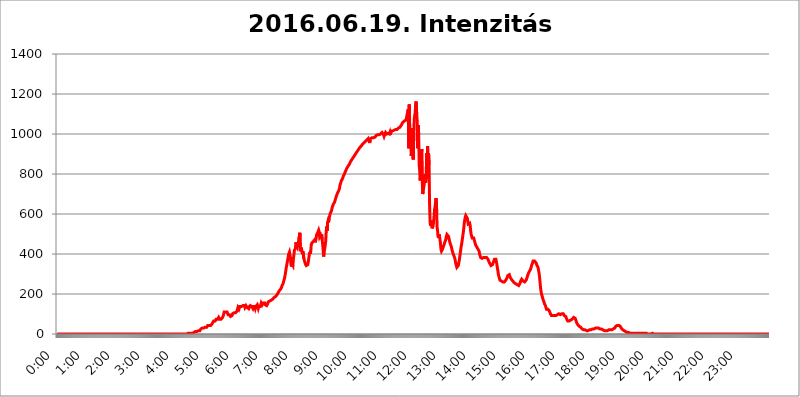
| Category | 2016.06.19. Intenzitás [W/m^2] |
|---|---|
| 0.0 | 0 |
| 0.0006944444444444445 | 0 |
| 0.001388888888888889 | 0 |
| 0.0020833333333333333 | 0 |
| 0.002777777777777778 | 0 |
| 0.003472222222222222 | 0 |
| 0.004166666666666667 | 0 |
| 0.004861111111111111 | 0 |
| 0.005555555555555556 | 0 |
| 0.0062499999999999995 | 0 |
| 0.006944444444444444 | 0 |
| 0.007638888888888889 | 0 |
| 0.008333333333333333 | 0 |
| 0.009027777777777779 | 0 |
| 0.009722222222222222 | 0 |
| 0.010416666666666666 | 0 |
| 0.011111111111111112 | 0 |
| 0.011805555555555555 | 0 |
| 0.012499999999999999 | 0 |
| 0.013194444444444444 | 0 |
| 0.013888888888888888 | 0 |
| 0.014583333333333332 | 0 |
| 0.015277777777777777 | 0 |
| 0.015972222222222224 | 0 |
| 0.016666666666666666 | 0 |
| 0.017361111111111112 | 0 |
| 0.018055555555555557 | 0 |
| 0.01875 | 0 |
| 0.019444444444444445 | 0 |
| 0.02013888888888889 | 0 |
| 0.020833333333333332 | 0 |
| 0.02152777777777778 | 0 |
| 0.022222222222222223 | 0 |
| 0.02291666666666667 | 0 |
| 0.02361111111111111 | 0 |
| 0.024305555555555556 | 0 |
| 0.024999999999999998 | 0 |
| 0.025694444444444447 | 0 |
| 0.02638888888888889 | 0 |
| 0.027083333333333334 | 0 |
| 0.027777777777777776 | 0 |
| 0.02847222222222222 | 0 |
| 0.029166666666666664 | 0 |
| 0.029861111111111113 | 0 |
| 0.030555555555555555 | 0 |
| 0.03125 | 0 |
| 0.03194444444444445 | 0 |
| 0.03263888888888889 | 0 |
| 0.03333333333333333 | 0 |
| 0.034027777777777775 | 0 |
| 0.034722222222222224 | 0 |
| 0.035416666666666666 | 0 |
| 0.036111111111111115 | 0 |
| 0.03680555555555556 | 0 |
| 0.0375 | 0 |
| 0.03819444444444444 | 0 |
| 0.03888888888888889 | 0 |
| 0.03958333333333333 | 0 |
| 0.04027777777777778 | 0 |
| 0.04097222222222222 | 0 |
| 0.041666666666666664 | 0 |
| 0.042361111111111106 | 0 |
| 0.04305555555555556 | 0 |
| 0.043750000000000004 | 0 |
| 0.044444444444444446 | 0 |
| 0.04513888888888889 | 0 |
| 0.04583333333333334 | 0 |
| 0.04652777777777778 | 0 |
| 0.04722222222222222 | 0 |
| 0.04791666666666666 | 0 |
| 0.04861111111111111 | 0 |
| 0.049305555555555554 | 0 |
| 0.049999999999999996 | 0 |
| 0.05069444444444445 | 0 |
| 0.051388888888888894 | 0 |
| 0.052083333333333336 | 0 |
| 0.05277777777777778 | 0 |
| 0.05347222222222222 | 0 |
| 0.05416666666666667 | 0 |
| 0.05486111111111111 | 0 |
| 0.05555555555555555 | 0 |
| 0.05625 | 0 |
| 0.05694444444444444 | 0 |
| 0.057638888888888885 | 0 |
| 0.05833333333333333 | 0 |
| 0.05902777777777778 | 0 |
| 0.059722222222222225 | 0 |
| 0.06041666666666667 | 0 |
| 0.061111111111111116 | 0 |
| 0.06180555555555556 | 0 |
| 0.0625 | 0 |
| 0.06319444444444444 | 0 |
| 0.06388888888888888 | 0 |
| 0.06458333333333334 | 0 |
| 0.06527777777777778 | 0 |
| 0.06597222222222222 | 0 |
| 0.06666666666666667 | 0 |
| 0.06736111111111111 | 0 |
| 0.06805555555555555 | 0 |
| 0.06874999999999999 | 0 |
| 0.06944444444444443 | 0 |
| 0.07013888888888889 | 0 |
| 0.07083333333333333 | 0 |
| 0.07152777777777779 | 0 |
| 0.07222222222222223 | 0 |
| 0.07291666666666667 | 0 |
| 0.07361111111111111 | 0 |
| 0.07430555555555556 | 0 |
| 0.075 | 0 |
| 0.07569444444444444 | 0 |
| 0.0763888888888889 | 0 |
| 0.07708333333333334 | 0 |
| 0.07777777777777778 | 0 |
| 0.07847222222222222 | 0 |
| 0.07916666666666666 | 0 |
| 0.0798611111111111 | 0 |
| 0.08055555555555556 | 0 |
| 0.08125 | 0 |
| 0.08194444444444444 | 0 |
| 0.08263888888888889 | 0 |
| 0.08333333333333333 | 0 |
| 0.08402777777777777 | 0 |
| 0.08472222222222221 | 0 |
| 0.08541666666666665 | 0 |
| 0.08611111111111112 | 0 |
| 0.08680555555555557 | 0 |
| 0.08750000000000001 | 0 |
| 0.08819444444444445 | 0 |
| 0.08888888888888889 | 0 |
| 0.08958333333333333 | 0 |
| 0.09027777777777778 | 0 |
| 0.09097222222222222 | 0 |
| 0.09166666666666667 | 0 |
| 0.09236111111111112 | 0 |
| 0.09305555555555556 | 0 |
| 0.09375 | 0 |
| 0.09444444444444444 | 0 |
| 0.09513888888888888 | 0 |
| 0.09583333333333333 | 0 |
| 0.09652777777777777 | 0 |
| 0.09722222222222222 | 0 |
| 0.09791666666666667 | 0 |
| 0.09861111111111111 | 0 |
| 0.09930555555555555 | 0 |
| 0.09999999999999999 | 0 |
| 0.10069444444444443 | 0 |
| 0.1013888888888889 | 0 |
| 0.10208333333333335 | 0 |
| 0.10277777777777779 | 0 |
| 0.10347222222222223 | 0 |
| 0.10416666666666667 | 0 |
| 0.10486111111111111 | 0 |
| 0.10555555555555556 | 0 |
| 0.10625 | 0 |
| 0.10694444444444444 | 0 |
| 0.1076388888888889 | 0 |
| 0.10833333333333334 | 0 |
| 0.10902777777777778 | 0 |
| 0.10972222222222222 | 0 |
| 0.1111111111111111 | 0 |
| 0.11180555555555556 | 0 |
| 0.11180555555555556 | 0 |
| 0.1125 | 0 |
| 0.11319444444444444 | 0 |
| 0.11388888888888889 | 0 |
| 0.11458333333333333 | 0 |
| 0.11527777777777777 | 0 |
| 0.11597222222222221 | 0 |
| 0.11666666666666665 | 0 |
| 0.1173611111111111 | 0 |
| 0.11805555555555557 | 0 |
| 0.11944444444444445 | 0 |
| 0.12013888888888889 | 0 |
| 0.12083333333333333 | 0 |
| 0.12152777777777778 | 0 |
| 0.12222222222222223 | 0 |
| 0.12291666666666667 | 0 |
| 0.12291666666666667 | 0 |
| 0.12361111111111112 | 0 |
| 0.12430555555555556 | 0 |
| 0.125 | 0 |
| 0.12569444444444444 | 0 |
| 0.12638888888888888 | 0 |
| 0.12708333333333333 | 0 |
| 0.16875 | 0 |
| 0.12847222222222224 | 0 |
| 0.12916666666666668 | 0 |
| 0.12986111111111112 | 0 |
| 0.13055555555555556 | 0 |
| 0.13125 | 0 |
| 0.13194444444444445 | 0 |
| 0.1326388888888889 | 0 |
| 0.13333333333333333 | 0 |
| 0.13402777777777777 | 0 |
| 0.13402777777777777 | 0 |
| 0.13472222222222222 | 0 |
| 0.13541666666666666 | 0 |
| 0.1361111111111111 | 0 |
| 0.13749999999999998 | 0 |
| 0.13819444444444443 | 0 |
| 0.1388888888888889 | 0 |
| 0.13958333333333334 | 0 |
| 0.14027777777777778 | 0 |
| 0.14097222222222222 | 0 |
| 0.14166666666666666 | 0 |
| 0.1423611111111111 | 0 |
| 0.14305555555555557 | 0 |
| 0.14375000000000002 | 0 |
| 0.14444444444444446 | 0 |
| 0.1451388888888889 | 0 |
| 0.1451388888888889 | 0 |
| 0.14652777777777778 | 0 |
| 0.14722222222222223 | 0 |
| 0.14791666666666667 | 0 |
| 0.1486111111111111 | 0 |
| 0.14930555555555555 | 0 |
| 0.15 | 0 |
| 0.15069444444444444 | 0 |
| 0.15138888888888888 | 0 |
| 0.15208333333333332 | 0 |
| 0.15277777777777776 | 0 |
| 0.15347222222222223 | 0 |
| 0.15416666666666667 | 0 |
| 0.15486111111111112 | 0 |
| 0.15555555555555556 | 0 |
| 0.15625 | 0 |
| 0.15694444444444444 | 0 |
| 0.15763888888888888 | 0 |
| 0.15833333333333333 | 0 |
| 0.15902777777777777 | 0 |
| 0.15972222222222224 | 0 |
| 0.16041666666666668 | 0 |
| 0.16111111111111112 | 0 |
| 0.16180555555555556 | 0 |
| 0.1625 | 0 |
| 0.16319444444444445 | 0 |
| 0.1638888888888889 | 0 |
| 0.16458333333333333 | 0 |
| 0.16527777777777777 | 0 |
| 0.16597222222222222 | 0 |
| 0.16666666666666666 | 0 |
| 0.1673611111111111 | 0 |
| 0.16805555555555554 | 0 |
| 0.16874999999999998 | 0 |
| 0.16944444444444443 | 0 |
| 0.17013888888888887 | 0 |
| 0.1708333333333333 | 0 |
| 0.17152777777777775 | 0 |
| 0.17222222222222225 | 0 |
| 0.1729166666666667 | 0 |
| 0.17361111111111113 | 0 |
| 0.17430555555555557 | 0 |
| 0.17500000000000002 | 0 |
| 0.17569444444444446 | 0 |
| 0.1763888888888889 | 0 |
| 0.17708333333333334 | 0 |
| 0.17777777777777778 | 0 |
| 0.17847222222222223 | 0 |
| 0.17916666666666667 | 0 |
| 0.1798611111111111 | 0 |
| 0.18055555555555555 | 0 |
| 0.18125 | 0 |
| 0.18194444444444444 | 3.525 |
| 0.1826388888888889 | 3.525 |
| 0.18333333333333335 | 3.525 |
| 0.1840277777777778 | 3.525 |
| 0.18472222222222223 | 3.525 |
| 0.18541666666666667 | 3.525 |
| 0.18611111111111112 | 3.525 |
| 0.18680555555555556 | 3.525 |
| 0.1875 | 3.525 |
| 0.18819444444444444 | 3.525 |
| 0.18888888888888888 | 3.525 |
| 0.18958333333333333 | 3.525 |
| 0.19027777777777777 | 7.887 |
| 0.1909722222222222 | 7.887 |
| 0.19166666666666665 | 7.887 |
| 0.19236111111111112 | 7.887 |
| 0.19305555555555554 | 7.887 |
| 0.19375 | 12.257 |
| 0.19444444444444445 | 12.257 |
| 0.1951388888888889 | 12.257 |
| 0.19583333333333333 | 12.257 |
| 0.19652777777777777 | 12.257 |
| 0.19722222222222222 | 16.636 |
| 0.19791666666666666 | 16.636 |
| 0.1986111111111111 | 16.636 |
| 0.19930555555555554 | 16.636 |
| 0.19999999999999998 | 16.636 |
| 0.20069444444444443 | 21.024 |
| 0.20138888888888887 | 25.419 |
| 0.2020833333333333 | 25.419 |
| 0.2027777777777778 | 25.419 |
| 0.2034722222222222 | 29.823 |
| 0.2041666666666667 | 29.823 |
| 0.20486111111111113 | 29.823 |
| 0.20555555555555557 | 29.823 |
| 0.20625000000000002 | 34.234 |
| 0.20694444444444446 | 34.234 |
| 0.2076388888888889 | 34.234 |
| 0.20833333333333334 | 34.234 |
| 0.20902777777777778 | 34.234 |
| 0.20972222222222223 | 34.234 |
| 0.21041666666666667 | 38.653 |
| 0.2111111111111111 | 43.079 |
| 0.21180555555555555 | 43.079 |
| 0.2125 | 43.079 |
| 0.21319444444444444 | 43.079 |
| 0.2138888888888889 | 43.079 |
| 0.21458333333333335 | 43.079 |
| 0.2152777777777778 | 43.079 |
| 0.21597222222222223 | 43.079 |
| 0.21666666666666667 | 47.511 |
| 0.21736111111111112 | 51.951 |
| 0.21805555555555556 | 56.398 |
| 0.21875 | 56.398 |
| 0.21944444444444444 | 65.31 |
| 0.22013888888888888 | 65.31 |
| 0.22083333333333333 | 65.31 |
| 0.22152777777777777 | 65.31 |
| 0.2222222222222222 | 65.31 |
| 0.22291666666666665 | 74.246 |
| 0.2236111111111111 | 74.246 |
| 0.22430555555555556 | 78.722 |
| 0.225 | 74.246 |
| 0.22569444444444445 | 78.722 |
| 0.2263888888888889 | 83.205 |
| 0.22708333333333333 | 83.205 |
| 0.22777777777777777 | 74.246 |
| 0.22847222222222222 | 74.246 |
| 0.22916666666666666 | 74.246 |
| 0.2298611111111111 | 74.246 |
| 0.23055555555555554 | 74.246 |
| 0.23124999999999998 | 78.722 |
| 0.23194444444444443 | 83.205 |
| 0.23263888888888887 | 78.722 |
| 0.2333333333333333 | 96.682 |
| 0.2340277777777778 | 110.201 |
| 0.2347222222222222 | 110.201 |
| 0.2354166666666667 | 110.201 |
| 0.23611111111111113 | 110.201 |
| 0.23680555555555557 | 110.201 |
| 0.23750000000000002 | 110.201 |
| 0.23819444444444446 | 110.201 |
| 0.2388888888888889 | 110.201 |
| 0.23958333333333334 | 96.682 |
| 0.24027777777777778 | 101.184 |
| 0.24097222222222223 | 92.184 |
| 0.24166666666666667 | 96.682 |
| 0.2423611111111111 | 96.682 |
| 0.24305555555555555 | 87.692 |
| 0.24375 | 87.692 |
| 0.24444444444444446 | 87.692 |
| 0.24513888888888888 | 92.184 |
| 0.24583333333333335 | 101.184 |
| 0.2465277777777778 | 101.184 |
| 0.24722222222222223 | 105.69 |
| 0.24791666666666667 | 105.69 |
| 0.24861111111111112 | 110.201 |
| 0.24930555555555556 | 110.201 |
| 0.25 | 105.69 |
| 0.25069444444444444 | 101.184 |
| 0.2513888888888889 | 110.201 |
| 0.2520833333333333 | 114.716 |
| 0.25277777777777777 | 123.758 |
| 0.2534722222222222 | 132.814 |
| 0.25416666666666665 | 137.347 |
| 0.2548611111111111 | 123.758 |
| 0.2555555555555556 | 128.284 |
| 0.25625000000000003 | 137.347 |
| 0.2569444444444445 | 141.884 |
| 0.2576388888888889 | 132.814 |
| 0.25833333333333336 | 137.347 |
| 0.2590277777777778 | 141.884 |
| 0.25972222222222224 | 141.884 |
| 0.2604166666666667 | 141.884 |
| 0.2611111111111111 | 141.884 |
| 0.26180555555555557 | 141.884 |
| 0.2625 | 141.884 |
| 0.26319444444444445 | 132.814 |
| 0.2638888888888889 | 137.347 |
| 0.26458333333333334 | 141.884 |
| 0.2652777777777778 | 137.347 |
| 0.2659722222222222 | 132.814 |
| 0.26666666666666666 | 128.284 |
| 0.2673611111111111 | 128.284 |
| 0.26805555555555555 | 128.284 |
| 0.26875 | 141.884 |
| 0.26944444444444443 | 132.814 |
| 0.2701388888888889 | 137.347 |
| 0.2708333333333333 | 141.884 |
| 0.27152777777777776 | 137.347 |
| 0.2722222222222222 | 137.347 |
| 0.27291666666666664 | 137.347 |
| 0.2736111111111111 | 132.814 |
| 0.2743055555555555 | 128.284 |
| 0.27499999999999997 | 137.347 |
| 0.27569444444444446 | 137.347 |
| 0.27638888888888885 | 137.347 |
| 0.27708333333333335 | 137.347 |
| 0.2777777777777778 | 128.284 |
| 0.27847222222222223 | 137.347 |
| 0.2791666666666667 | 137.347 |
| 0.2798611111111111 | 141.884 |
| 0.28055555555555556 | 146.423 |
| 0.28125 | 146.423 |
| 0.28194444444444444 | 128.284 |
| 0.2826388888888889 | 137.347 |
| 0.2833333333333333 | 141.884 |
| 0.28402777777777777 | 141.884 |
| 0.2847222222222222 | 137.347 |
| 0.28541666666666665 | 137.347 |
| 0.28611111111111115 | 155.509 |
| 0.28680555555555554 | 150.964 |
| 0.28750000000000003 | 146.423 |
| 0.2881944444444445 | 146.423 |
| 0.2888888888888889 | 155.509 |
| 0.28958333333333336 | 155.509 |
| 0.2902777777777778 | 155.509 |
| 0.29097222222222224 | 155.509 |
| 0.2916666666666667 | 146.423 |
| 0.2923611111111111 | 146.423 |
| 0.29305555555555557 | 141.884 |
| 0.29375 | 141.884 |
| 0.29444444444444445 | 146.423 |
| 0.2951388888888889 | 150.964 |
| 0.29583333333333334 | 160.056 |
| 0.2965277777777778 | 155.509 |
| 0.2972222222222222 | 160.056 |
| 0.29791666666666666 | 164.605 |
| 0.2986111111111111 | 169.156 |
| 0.29930555555555555 | 169.156 |
| 0.3 | 169.156 |
| 0.30069444444444443 | 169.156 |
| 0.3013888888888889 | 173.709 |
| 0.3020833333333333 | 173.709 |
| 0.30277777777777776 | 178.264 |
| 0.3034722222222222 | 178.264 |
| 0.30416666666666664 | 182.82 |
| 0.3048611111111111 | 182.82 |
| 0.3055555555555555 | 187.378 |
| 0.30624999999999997 | 187.378 |
| 0.3069444444444444 | 191.937 |
| 0.3076388888888889 | 191.937 |
| 0.30833333333333335 | 196.497 |
| 0.3090277777777778 | 201.058 |
| 0.30972222222222223 | 205.62 |
| 0.3104166666666667 | 210.182 |
| 0.3111111111111111 | 214.746 |
| 0.31180555555555556 | 219.309 |
| 0.3125 | 219.309 |
| 0.31319444444444444 | 223.873 |
| 0.3138888888888889 | 228.436 |
| 0.3145833333333333 | 233 |
| 0.31527777777777777 | 242.127 |
| 0.3159722222222222 | 246.689 |
| 0.31666666666666665 | 251.251 |
| 0.31736111111111115 | 260.373 |
| 0.31805555555555554 | 269.49 |
| 0.31875000000000003 | 278.603 |
| 0.3194444444444445 | 292.259 |
| 0.3201388888888889 | 305.898 |
| 0.32083333333333336 | 324.052 |
| 0.3215277777777778 | 337.639 |
| 0.32222222222222224 | 351.198 |
| 0.3229166666666667 | 364.728 |
| 0.3236111111111111 | 378.224 |
| 0.32430555555555557 | 396.164 |
| 0.325 | 396.164 |
| 0.32569444444444445 | 409.574 |
| 0.3263888888888889 | 405.108 |
| 0.32708333333333334 | 382.715 |
| 0.3277777777777778 | 346.682 |
| 0.3284722222222222 | 337.639 |
| 0.32916666666666666 | 351.198 |
| 0.3298611111111111 | 355.712 |
| 0.33055555555555555 | 342.162 |
| 0.33125 | 378.224 |
| 0.33194444444444443 | 396.164 |
| 0.3326388888888889 | 418.492 |
| 0.3333333333333333 | 414.035 |
| 0.3340277777777778 | 427.39 |
| 0.3347222222222222 | 458.38 |
| 0.3354166666666667 | 453.968 |
| 0.3361111111111111 | 458.38 |
| 0.3368055555555556 | 436.27 |
| 0.33749999999999997 | 431.833 |
| 0.33819444444444446 | 453.968 |
| 0.33888888888888885 | 480.356 |
| 0.33958333333333335 | 489.108 |
| 0.34027777777777773 | 506.542 |
| 0.34097222222222223 | 414.035 |
| 0.3416666666666666 | 409.574 |
| 0.3423611111111111 | 431.833 |
| 0.3430555555555555 | 414.035 |
| 0.34375 | 400.638 |
| 0.3444444444444445 | 414.035 |
| 0.3451388888888889 | 409.574 |
| 0.3458333333333334 | 378.224 |
| 0.34652777777777777 | 369.23 |
| 0.34722222222222227 | 360.221 |
| 0.34791666666666665 | 351.198 |
| 0.34861111111111115 | 346.682 |
| 0.34930555555555554 | 342.162 |
| 0.35000000000000003 | 342.162 |
| 0.3506944444444444 | 342.162 |
| 0.3513888888888889 | 346.682 |
| 0.3520833333333333 | 360.221 |
| 0.3527777777777778 | 378.224 |
| 0.3534722222222222 | 396.164 |
| 0.3541666666666667 | 409.574 |
| 0.3548611111111111 | 400.638 |
| 0.35555555555555557 | 414.035 |
| 0.35625 | 445.129 |
| 0.35694444444444445 | 453.968 |
| 0.3576388888888889 | 453.968 |
| 0.35833333333333334 | 458.38 |
| 0.3590277777777778 | 462.786 |
| 0.3597222222222222 | 458.38 |
| 0.36041666666666666 | 462.786 |
| 0.3611111111111111 | 471.582 |
| 0.36180555555555555 | 458.38 |
| 0.3625 | 467.187 |
| 0.36319444444444443 | 480.356 |
| 0.3638888888888889 | 497.836 |
| 0.3645833333333333 | 502.192 |
| 0.3652777777777778 | 506.542 |
| 0.3659722222222222 | 506.542 |
| 0.3666666666666667 | 519.555 |
| 0.3673611111111111 | 510.885 |
| 0.3680555555555556 | 484.735 |
| 0.36874999999999997 | 489.108 |
| 0.36944444444444446 | 493.475 |
| 0.37013888888888885 | 484.735 |
| 0.37083333333333335 | 497.836 |
| 0.37152777777777773 | 471.582 |
| 0.37222222222222223 | 449.551 |
| 0.3729166666666666 | 418.492 |
| 0.3736111111111111 | 387.202 |
| 0.3743055555555555 | 409.574 |
| 0.375 | 422.943 |
| 0.3756944444444445 | 440.702 |
| 0.3763888888888889 | 458.38 |
| 0.3770833333333334 | 502.192 |
| 0.37777777777777777 | 536.82 |
| 0.37847222222222227 | 515.223 |
| 0.37916666666666665 | 558.261 |
| 0.37986111111111115 | 566.793 |
| 0.38055555555555554 | 558.261 |
| 0.38125000000000003 | 579.542 |
| 0.3819444444444444 | 588.009 |
| 0.3826388888888889 | 600.661 |
| 0.3833333333333333 | 604.864 |
| 0.3840277777777778 | 600.661 |
| 0.3847222222222222 | 617.436 |
| 0.3854166666666667 | 629.948 |
| 0.3861111111111111 | 638.256 |
| 0.38680555555555557 | 642.4 |
| 0.3875 | 650.667 |
| 0.38819444444444445 | 654.791 |
| 0.3888888888888889 | 658.909 |
| 0.38958333333333334 | 667.123 |
| 0.3902777777777778 | 675.311 |
| 0.3909722222222222 | 683.473 |
| 0.39166666666666666 | 691.608 |
| 0.3923611111111111 | 687.544 |
| 0.39305555555555555 | 703.762 |
| 0.39375 | 707.8 |
| 0.39444444444444443 | 703.762 |
| 0.3951388888888889 | 719.877 |
| 0.3958333333333333 | 727.896 |
| 0.3965277777777778 | 743.859 |
| 0.3972222222222222 | 751.803 |
| 0.3979166666666667 | 759.723 |
| 0.3986111111111111 | 767.62 |
| 0.3993055555555556 | 771.559 |
| 0.39999999999999997 | 775.492 |
| 0.40069444444444446 | 783.342 |
| 0.40138888888888885 | 791.169 |
| 0.40208333333333335 | 795.074 |
| 0.40277777777777773 | 798.974 |
| 0.40347222222222223 | 806.757 |
| 0.4041666666666666 | 810.641 |
| 0.4048611111111111 | 818.392 |
| 0.4055555555555555 | 822.26 |
| 0.40625 | 829.981 |
| 0.4069444444444445 | 829.981 |
| 0.4076388888888889 | 837.682 |
| 0.4083333333333334 | 841.526 |
| 0.40902777777777777 | 845.365 |
| 0.40972222222222227 | 849.199 |
| 0.41041666666666665 | 853.029 |
| 0.41111111111111115 | 860.676 |
| 0.41180555555555554 | 860.676 |
| 0.41250000000000003 | 868.305 |
| 0.4131944444444444 | 868.305 |
| 0.4138888888888889 | 875.918 |
| 0.4145833333333333 | 875.918 |
| 0.4152777777777778 | 883.516 |
| 0.4159722222222222 | 887.309 |
| 0.4166666666666667 | 887.309 |
| 0.4173611111111111 | 894.885 |
| 0.41805555555555557 | 898.668 |
| 0.41875 | 902.447 |
| 0.41944444444444445 | 906.223 |
| 0.4201388888888889 | 909.996 |
| 0.42083333333333334 | 913.766 |
| 0.4215277777777778 | 917.534 |
| 0.4222222222222222 | 921.298 |
| 0.42291666666666666 | 925.06 |
| 0.4236111111111111 | 928.819 |
| 0.42430555555555555 | 932.576 |
| 0.425 | 932.576 |
| 0.42569444444444443 | 936.33 |
| 0.4263888888888889 | 940.082 |
| 0.4270833333333333 | 943.832 |
| 0.4277777777777778 | 947.58 |
| 0.4284722222222222 | 947.58 |
| 0.4291666666666667 | 951.327 |
| 0.4298611111111111 | 955.071 |
| 0.4305555555555556 | 955.071 |
| 0.43124999999999997 | 958.814 |
| 0.43194444444444446 | 962.555 |
| 0.43263888888888885 | 966.295 |
| 0.43333333333333335 | 966.295 |
| 0.43402777777777773 | 970.034 |
| 0.43472222222222223 | 973.772 |
| 0.4354166666666666 | 973.772 |
| 0.4361111111111111 | 977.508 |
| 0.4368055555555555 | 973.772 |
| 0.4375 | 962.555 |
| 0.4381944444444445 | 955.071 |
| 0.4388888888888889 | 970.034 |
| 0.4395833333333334 | 977.508 |
| 0.44027777777777777 | 977.508 |
| 0.44097222222222227 | 981.244 |
| 0.44166666666666665 | 981.244 |
| 0.44236111111111115 | 981.244 |
| 0.44305555555555554 | 981.244 |
| 0.44375000000000003 | 981.244 |
| 0.4444444444444444 | 981.244 |
| 0.4451388888888889 | 984.98 |
| 0.4458333333333333 | 984.98 |
| 0.4465277777777778 | 988.714 |
| 0.4472222222222222 | 992.448 |
| 0.4479166666666667 | 992.448 |
| 0.4486111111111111 | 992.448 |
| 0.44930555555555557 | 996.182 |
| 0.45 | 996.182 |
| 0.45069444444444445 | 996.182 |
| 0.4513888888888889 | 996.182 |
| 0.45208333333333334 | 999.916 |
| 0.4527777777777778 | 999.916 |
| 0.4534722222222222 | 999.916 |
| 0.45416666666666666 | 1003.65 |
| 0.4548611111111111 | 1003.65 |
| 0.45555555555555555 | 1007.383 |
| 0.45625 | 1011.118 |
| 0.45694444444444443 | 1003.65 |
| 0.4576388888888889 | 996.182 |
| 0.4583333333333333 | 988.714 |
| 0.4590277777777778 | 996.182 |
| 0.4597222222222222 | 992.448 |
| 0.4604166666666667 | 1007.383 |
| 0.4611111111111111 | 1011.118 |
| 0.4618055555555556 | 999.916 |
| 0.46249999999999997 | 999.916 |
| 0.46319444444444446 | 999.916 |
| 0.46388888888888885 | 1003.65 |
| 0.46458333333333335 | 1007.383 |
| 0.46527777777777773 | 1007.383 |
| 0.46597222222222223 | 999.916 |
| 0.4666666666666666 | 1007.383 |
| 0.4673611111111111 | 996.182 |
| 0.4680555555555555 | 1014.852 |
| 0.46875 | 1014.852 |
| 0.4694444444444445 | 1018.587 |
| 0.4701388888888889 | 1014.852 |
| 0.4708333333333334 | 1018.587 |
| 0.47152777777777777 | 1018.587 |
| 0.47222222222222227 | 1018.587 |
| 0.47291666666666665 | 1022.323 |
| 0.47361111111111115 | 1022.323 |
| 0.47430555555555554 | 1022.323 |
| 0.47500000000000003 | 1022.323 |
| 0.4756944444444444 | 1022.323 |
| 0.4763888888888889 | 1022.323 |
| 0.4770833333333333 | 1026.06 |
| 0.4777777777777778 | 1026.06 |
| 0.4784722222222222 | 1029.798 |
| 0.4791666666666667 | 1029.798 |
| 0.4798611111111111 | 1029.798 |
| 0.48055555555555557 | 1033.537 |
| 0.48125 | 1037.277 |
| 0.48194444444444445 | 1041.019 |
| 0.4826388888888889 | 1044.762 |
| 0.48333333333333334 | 1048.508 |
| 0.4840277777777778 | 1056.004 |
| 0.4847222222222222 | 1056.004 |
| 0.48541666666666666 | 1059.756 |
| 0.4861111111111111 | 1063.51 |
| 0.48680555555555555 | 1067.267 |
| 0.4875 | 1067.267 |
| 0.48819444444444443 | 1067.267 |
| 0.4888888888888889 | 1071.027 |
| 0.4895833333333333 | 1074.789 |
| 0.4902777777777778 | 1089.873 |
| 0.4909722222222222 | 1101.226 |
| 0.4916666666666667 | 1116.426 |
| 0.4923611111111111 | 1124.056 |
| 0.4930555555555556 | 928.819 |
| 0.49374999999999997 | 1147.086 |
| 0.49444444444444446 | 999.916 |
| 0.49513888888888885 | 999.916 |
| 0.49583333333333335 | 962.555 |
| 0.49652777777777773 | 891.099 |
| 0.49722222222222223 | 925.06 |
| 0.4979166666666666 | 1029.798 |
| 0.4986111111111111 | 1029.798 |
| 0.4993055555555555 | 872.114 |
| 0.5 | 996.182 |
| 0.5006944444444444 | 1071.027 |
| 0.5013888888888889 | 1093.653 |
| 0.5020833333333333 | 1108.816 |
| 0.5027777777777778 | 1154.814 |
| 0.5034722222222222 | 1162.571 |
| 0.5041666666666667 | 1097.437 |
| 0.5048611111111111 | 1063.51 |
| 0.5055555555555555 | 928.819 |
| 0.50625 | 1044.762 |
| 0.5069444444444444 | 999.916 |
| 0.5076388888888889 | 845.365 |
| 0.5083333333333333 | 818.392 |
| 0.5090277777777777 | 767.62 |
| 0.5097222222222222 | 798.974 |
| 0.5104166666666666 | 779.42 |
| 0.5111111111111112 | 925.06 |
| 0.5118055555555555 | 783.342 |
| 0.5125000000000001 | 699.717 |
| 0.5131944444444444 | 711.832 |
| 0.513888888888889 | 715.858 |
| 0.5145833333333333 | 747.834 |
| 0.5152777777777778 | 787.258 |
| 0.5159722222222222 | 798.974 |
| 0.5166666666666667 | 755.766 |
| 0.517361111111111 | 771.559 |
| 0.5180555555555556 | 902.447 |
| 0.5187499999999999 | 814.519 |
| 0.5194444444444445 | 940.082 |
| 0.5201388888888888 | 775.492 |
| 0.5208333333333334 | 902.447 |
| 0.5215277777777778 | 845.365 |
| 0.5222222222222223 | 646.537 |
| 0.5229166666666667 | 558.261 |
| 0.5236111111111111 | 541.121 |
| 0.5243055555555556 | 566.793 |
| 0.525 | 549.704 |
| 0.5256944444444445 | 528.2 |
| 0.5263888888888889 | 528.2 |
| 0.5270833333333333 | 541.121 |
| 0.5277777777777778 | 558.261 |
| 0.5284722222222222 | 583.779 |
| 0.5291666666666667 | 621.613 |
| 0.5298611111111111 | 634.105 |
| 0.5305555555555556 | 658.909 |
| 0.53125 | 679.395 |
| 0.5319444444444444 | 650.667 |
| 0.5326388888888889 | 536.82 |
| 0.5333333333333333 | 519.555 |
| 0.5340277777777778 | 489.108 |
| 0.5347222222222222 | 480.356 |
| 0.5354166666666667 | 497.836 |
| 0.5361111111111111 | 489.108 |
| 0.5368055555555555 | 471.582 |
| 0.5375 | 453.968 |
| 0.5381944444444444 | 422.943 |
| 0.5388888888888889 | 414.035 |
| 0.5395833333333333 | 414.035 |
| 0.5402777777777777 | 422.943 |
| 0.5409722222222222 | 431.833 |
| 0.5416666666666666 | 436.27 |
| 0.5423611111111112 | 445.129 |
| 0.5430555555555555 | 453.968 |
| 0.5437500000000001 | 458.38 |
| 0.5444444444444444 | 467.187 |
| 0.545138888888889 | 475.972 |
| 0.5458333333333333 | 489.108 |
| 0.5465277777777778 | 497.836 |
| 0.5472222222222222 | 502.192 |
| 0.5479166666666667 | 497.836 |
| 0.548611111111111 | 489.108 |
| 0.5493055555555556 | 480.356 |
| 0.5499999999999999 | 467.187 |
| 0.5506944444444445 | 458.38 |
| 0.5513888888888888 | 449.551 |
| 0.5520833333333334 | 445.129 |
| 0.5527777777777778 | 436.27 |
| 0.5534722222222223 | 422.943 |
| 0.5541666666666667 | 414.035 |
| 0.5548611111111111 | 405.108 |
| 0.5555555555555556 | 400.638 |
| 0.55625 | 391.685 |
| 0.5569444444444445 | 387.202 |
| 0.5576388888888889 | 378.224 |
| 0.5583333333333333 | 364.728 |
| 0.5590277777777778 | 351.198 |
| 0.5597222222222222 | 342.162 |
| 0.5604166666666667 | 333.113 |
| 0.5611111111111111 | 333.113 |
| 0.5618055555555556 | 333.113 |
| 0.5625 | 342.162 |
| 0.5631944444444444 | 355.712 |
| 0.5638888888888889 | 369.23 |
| 0.5645833333333333 | 387.202 |
| 0.5652777777777778 | 405.108 |
| 0.5659722222222222 | 422.943 |
| 0.5666666666666667 | 440.702 |
| 0.5673611111111111 | 453.968 |
| 0.5680555555555555 | 471.582 |
| 0.56875 | 489.108 |
| 0.5694444444444444 | 506.542 |
| 0.5701388888888889 | 528.2 |
| 0.5708333333333333 | 553.986 |
| 0.5715277777777777 | 571.049 |
| 0.5722222222222222 | 583.779 |
| 0.5729166666666666 | 592.233 |
| 0.5736111111111112 | 596.45 |
| 0.5743055555555555 | 588.009 |
| 0.5750000000000001 | 579.542 |
| 0.5756944444444444 | 566.793 |
| 0.576388888888889 | 549.704 |
| 0.5770833333333333 | 549.704 |
| 0.5777777777777778 | 549.704 |
| 0.5784722222222222 | 553.986 |
| 0.5791666666666667 | 541.121 |
| 0.579861111111111 | 515.223 |
| 0.5805555555555556 | 497.836 |
| 0.5812499999999999 | 489.108 |
| 0.5819444444444445 | 480.356 |
| 0.5826388888888888 | 475.972 |
| 0.5833333333333334 | 480.356 |
| 0.5840277777777778 | 480.356 |
| 0.5847222222222223 | 475.972 |
| 0.5854166666666667 | 462.786 |
| 0.5861111111111111 | 453.968 |
| 0.5868055555555556 | 445.129 |
| 0.5875 | 440.702 |
| 0.5881944444444445 | 436.27 |
| 0.5888888888888889 | 436.27 |
| 0.5895833333333333 | 431.833 |
| 0.5902777777777778 | 422.943 |
| 0.5909722222222222 | 418.492 |
| 0.5916666666666667 | 414.035 |
| 0.5923611111111111 | 400.638 |
| 0.5930555555555556 | 391.685 |
| 0.59375 | 382.715 |
| 0.5944444444444444 | 378.224 |
| 0.5951388888888889 | 378.224 |
| 0.5958333333333333 | 378.224 |
| 0.5965277777777778 | 382.715 |
| 0.5972222222222222 | 382.715 |
| 0.5979166666666667 | 382.715 |
| 0.5986111111111111 | 382.715 |
| 0.5993055555555555 | 382.715 |
| 0.6 | 382.715 |
| 0.6006944444444444 | 387.202 |
| 0.6013888888888889 | 382.715 |
| 0.6020833333333333 | 382.715 |
| 0.6027777777777777 | 378.224 |
| 0.6034722222222222 | 378.224 |
| 0.6041666666666666 | 373.729 |
| 0.6048611111111112 | 369.23 |
| 0.6055555555555555 | 360.221 |
| 0.6062500000000001 | 355.712 |
| 0.6069444444444444 | 351.198 |
| 0.607638888888889 | 346.682 |
| 0.6083333333333333 | 342.162 |
| 0.6090277777777778 | 342.162 |
| 0.6097222222222222 | 342.162 |
| 0.6104166666666667 | 346.682 |
| 0.611111111111111 | 351.198 |
| 0.6118055555555556 | 360.221 |
| 0.6124999999999999 | 364.728 |
| 0.6131944444444445 | 373.729 |
| 0.6138888888888888 | 378.224 |
| 0.6145833333333334 | 378.224 |
| 0.6152777777777778 | 373.729 |
| 0.6159722222222223 | 360.221 |
| 0.6166666666666667 | 346.682 |
| 0.6173611111111111 | 328.584 |
| 0.6180555555555556 | 314.98 |
| 0.61875 | 296.808 |
| 0.6194444444444445 | 287.709 |
| 0.6201388888888889 | 278.603 |
| 0.6208333333333333 | 269.49 |
| 0.6215277777777778 | 269.49 |
| 0.6222222222222222 | 264.932 |
| 0.6229166666666667 | 264.932 |
| 0.6236111111111111 | 264.932 |
| 0.6243055555555556 | 260.373 |
| 0.625 | 260.373 |
| 0.6256944444444444 | 260.373 |
| 0.6263888888888889 | 260.373 |
| 0.6270833333333333 | 260.373 |
| 0.6277777777777778 | 264.932 |
| 0.6284722222222222 | 264.932 |
| 0.6291666666666667 | 269.49 |
| 0.6298611111111111 | 274.047 |
| 0.6305555555555555 | 278.603 |
| 0.63125 | 283.156 |
| 0.6319444444444444 | 292.259 |
| 0.6326388888888889 | 296.808 |
| 0.6333333333333333 | 296.808 |
| 0.6340277777777777 | 296.808 |
| 0.6347222222222222 | 292.259 |
| 0.6354166666666666 | 283.156 |
| 0.6361111111111112 | 278.603 |
| 0.6368055555555555 | 274.047 |
| 0.6375000000000001 | 269.49 |
| 0.6381944444444444 | 269.49 |
| 0.638888888888889 | 264.932 |
| 0.6395833333333333 | 260.373 |
| 0.6402777777777778 | 260.373 |
| 0.6409722222222222 | 255.813 |
| 0.6416666666666667 | 255.813 |
| 0.642361111111111 | 251.251 |
| 0.6430555555555556 | 251.251 |
| 0.6437499999999999 | 251.251 |
| 0.6444444444444445 | 251.251 |
| 0.6451388888888888 | 246.689 |
| 0.6458333333333334 | 242.127 |
| 0.6465277777777778 | 242.127 |
| 0.6472222222222223 | 242.127 |
| 0.6479166666666667 | 242.127 |
| 0.6486111111111111 | 246.689 |
| 0.6493055555555556 | 255.813 |
| 0.65 | 264.932 |
| 0.6506944444444445 | 269.49 |
| 0.6513888888888889 | 274.047 |
| 0.6520833333333333 | 269.49 |
| 0.6527777777777778 | 269.49 |
| 0.6534722222222222 | 264.932 |
| 0.6541666666666667 | 264.932 |
| 0.6548611111111111 | 264.932 |
| 0.6555555555555556 | 260.373 |
| 0.65625 | 260.373 |
| 0.6569444444444444 | 264.932 |
| 0.6576388888888889 | 269.49 |
| 0.6583333333333333 | 274.047 |
| 0.6590277777777778 | 283.156 |
| 0.6597222222222222 | 292.259 |
| 0.6604166666666667 | 296.808 |
| 0.6611111111111111 | 305.898 |
| 0.6618055555555555 | 310.44 |
| 0.6625 | 314.98 |
| 0.6631944444444444 | 319.517 |
| 0.6638888888888889 | 324.052 |
| 0.6645833333333333 | 333.113 |
| 0.6652777777777777 | 342.162 |
| 0.6659722222222222 | 346.682 |
| 0.6666666666666666 | 355.712 |
| 0.6673611111111111 | 364.728 |
| 0.6680555555555556 | 364.728 |
| 0.6687500000000001 | 364.728 |
| 0.6694444444444444 | 364.728 |
| 0.6701388888888888 | 364.728 |
| 0.6708333333333334 | 360.221 |
| 0.6715277777777778 | 355.712 |
| 0.6722222222222222 | 351.198 |
| 0.6729166666666666 | 342.162 |
| 0.6736111111111112 | 337.639 |
| 0.6743055555555556 | 333.113 |
| 0.6749999999999999 | 319.517 |
| 0.6756944444444444 | 305.898 |
| 0.6763888888888889 | 287.709 |
| 0.6770833333333334 | 260.373 |
| 0.6777777777777777 | 233 |
| 0.6784722222222223 | 214.746 |
| 0.6791666666666667 | 201.058 |
| 0.6798611111111111 | 191.937 |
| 0.6805555555555555 | 182.82 |
| 0.68125 | 173.709 |
| 0.6819444444444445 | 169.156 |
| 0.6826388888888889 | 160.056 |
| 0.6833333333333332 | 150.964 |
| 0.6840277777777778 | 146.423 |
| 0.6847222222222222 | 141.884 |
| 0.6854166666666667 | 132.814 |
| 0.686111111111111 | 123.758 |
| 0.6868055555555556 | 123.758 |
| 0.6875 | 123.758 |
| 0.6881944444444444 | 123.758 |
| 0.688888888888889 | 119.235 |
| 0.6895833333333333 | 119.235 |
| 0.6902777777777778 | 114.716 |
| 0.6909722222222222 | 110.201 |
| 0.6916666666666668 | 101.184 |
| 0.6923611111111111 | 96.682 |
| 0.6930555555555555 | 92.184 |
| 0.69375 | 92.184 |
| 0.6944444444444445 | 92.184 |
| 0.6951388888888889 | 92.184 |
| 0.6958333333333333 | 92.184 |
| 0.6965277777777777 | 92.184 |
| 0.6972222222222223 | 92.184 |
| 0.6979166666666666 | 92.184 |
| 0.6986111111111111 | 92.184 |
| 0.6993055555555556 | 92.184 |
| 0.7000000000000001 | 92.184 |
| 0.7006944444444444 | 92.184 |
| 0.7013888888888888 | 96.682 |
| 0.7020833333333334 | 101.184 |
| 0.7027777777777778 | 101.184 |
| 0.7034722222222222 | 101.184 |
| 0.7041666666666666 | 96.682 |
| 0.7048611111111112 | 96.682 |
| 0.7055555555555556 | 96.682 |
| 0.7062499999999999 | 96.682 |
| 0.7069444444444444 | 101.184 |
| 0.7076388888888889 | 101.184 |
| 0.7083333333333334 | 101.184 |
| 0.7090277777777777 | 101.184 |
| 0.7097222222222223 | 101.184 |
| 0.7104166666666667 | 96.682 |
| 0.7111111111111111 | 92.184 |
| 0.7118055555555555 | 92.184 |
| 0.7125 | 87.692 |
| 0.7131944444444445 | 87.692 |
| 0.7138888888888889 | 83.205 |
| 0.7145833333333332 | 74.246 |
| 0.7152777777777778 | 69.775 |
| 0.7159722222222222 | 65.31 |
| 0.7166666666666667 | 65.31 |
| 0.717361111111111 | 65.31 |
| 0.7180555555555556 | 65.31 |
| 0.71875 | 65.31 |
| 0.7194444444444444 | 69.775 |
| 0.720138888888889 | 69.775 |
| 0.7208333333333333 | 74.246 |
| 0.7215277777777778 | 74.246 |
| 0.7222222222222222 | 74.246 |
| 0.7229166666666668 | 78.722 |
| 0.7236111111111111 | 78.722 |
| 0.7243055555555555 | 83.205 |
| 0.725 | 83.205 |
| 0.7256944444444445 | 83.205 |
| 0.7263888888888889 | 78.722 |
| 0.7270833333333333 | 74.246 |
| 0.7277777777777777 | 65.31 |
| 0.7284722222222223 | 56.398 |
| 0.7291666666666666 | 51.951 |
| 0.7298611111111111 | 47.511 |
| 0.7305555555555556 | 43.079 |
| 0.7312500000000001 | 43.079 |
| 0.7319444444444444 | 38.653 |
| 0.7326388888888888 | 38.653 |
| 0.7333333333333334 | 34.234 |
| 0.7340277777777778 | 34.234 |
| 0.7347222222222222 | 29.823 |
| 0.7354166666666666 | 29.823 |
| 0.7361111111111112 | 25.419 |
| 0.7368055555555556 | 25.419 |
| 0.7374999999999999 | 21.024 |
| 0.7381944444444444 | 21.024 |
| 0.7388888888888889 | 21.024 |
| 0.7395833333333334 | 21.024 |
| 0.7402777777777777 | 21.024 |
| 0.7409722222222223 | 21.024 |
| 0.7416666666666667 | 21.024 |
| 0.7423611111111111 | 16.636 |
| 0.7430555555555555 | 16.636 |
| 0.74375 | 16.636 |
| 0.7444444444444445 | 16.636 |
| 0.7451388888888889 | 16.636 |
| 0.7458333333333332 | 16.636 |
| 0.7465277777777778 | 21.024 |
| 0.7472222222222222 | 21.024 |
| 0.7479166666666667 | 21.024 |
| 0.748611111111111 | 21.024 |
| 0.7493055555555556 | 21.024 |
| 0.75 | 21.024 |
| 0.7506944444444444 | 25.419 |
| 0.751388888888889 | 25.419 |
| 0.7520833333333333 | 25.419 |
| 0.7527777777777778 | 25.419 |
| 0.7534722222222222 | 25.419 |
| 0.7541666666666668 | 25.419 |
| 0.7548611111111111 | 29.823 |
| 0.7555555555555555 | 29.823 |
| 0.75625 | 29.823 |
| 0.7569444444444445 | 29.823 |
| 0.7576388888888889 | 29.823 |
| 0.7583333333333333 | 29.823 |
| 0.7590277777777777 | 29.823 |
| 0.7597222222222223 | 29.823 |
| 0.7604166666666666 | 25.419 |
| 0.7611111111111111 | 25.419 |
| 0.7618055555555556 | 25.419 |
| 0.7625000000000001 | 25.419 |
| 0.7631944444444444 | 25.419 |
| 0.7638888888888888 | 21.024 |
| 0.7645833333333334 | 21.024 |
| 0.7652777777777778 | 21.024 |
| 0.7659722222222222 | 21.024 |
| 0.7666666666666666 | 16.636 |
| 0.7673611111111112 | 16.636 |
| 0.7680555555555556 | 16.636 |
| 0.7687499999999999 | 16.636 |
| 0.7694444444444444 | 16.636 |
| 0.7701388888888889 | 16.636 |
| 0.7708333333333334 | 16.636 |
| 0.7715277777777777 | 16.636 |
| 0.7722222222222223 | 16.636 |
| 0.7729166666666667 | 16.636 |
| 0.7736111111111111 | 21.024 |
| 0.7743055555555555 | 21.024 |
| 0.775 | 21.024 |
| 0.7756944444444445 | 21.024 |
| 0.7763888888888889 | 21.024 |
| 0.7770833333333332 | 21.024 |
| 0.7777777777777778 | 21.024 |
| 0.7784722222222222 | 21.024 |
| 0.7791666666666667 | 21.024 |
| 0.779861111111111 | 25.419 |
| 0.7805555555555556 | 25.419 |
| 0.78125 | 29.823 |
| 0.7819444444444444 | 29.823 |
| 0.782638888888889 | 34.234 |
| 0.7833333333333333 | 38.653 |
| 0.7840277777777778 | 38.653 |
| 0.7847222222222222 | 38.653 |
| 0.7854166666666668 | 43.079 |
| 0.7861111111111111 | 43.079 |
| 0.7868055555555555 | 43.079 |
| 0.7875 | 43.079 |
| 0.7881944444444445 | 43.079 |
| 0.7888888888888889 | 38.653 |
| 0.7895833333333333 | 38.653 |
| 0.7902777777777777 | 34.234 |
| 0.7909722222222223 | 29.823 |
| 0.7916666666666666 | 29.823 |
| 0.7923611111111111 | 25.419 |
| 0.7930555555555556 | 21.024 |
| 0.7937500000000001 | 21.024 |
| 0.7944444444444444 | 21.024 |
| 0.7951388888888888 | 16.636 |
| 0.7958333333333334 | 16.636 |
| 0.7965277777777778 | 12.257 |
| 0.7972222222222222 | 12.257 |
| 0.7979166666666666 | 12.257 |
| 0.7986111111111112 | 12.257 |
| 0.7993055555555556 | 7.887 |
| 0.7999999999999999 | 7.887 |
| 0.8006944444444444 | 7.887 |
| 0.8013888888888889 | 7.887 |
| 0.8020833333333334 | 7.887 |
| 0.8027777777777777 | 7.887 |
| 0.8034722222222223 | 3.525 |
| 0.8041666666666667 | 3.525 |
| 0.8048611111111111 | 3.525 |
| 0.8055555555555555 | 3.525 |
| 0.80625 | 3.525 |
| 0.8069444444444445 | 3.525 |
| 0.8076388888888889 | 3.525 |
| 0.8083333333333332 | 3.525 |
| 0.8090277777777778 | 3.525 |
| 0.8097222222222222 | 3.525 |
| 0.8104166666666667 | 3.525 |
| 0.811111111111111 | 3.525 |
| 0.8118055555555556 | 3.525 |
| 0.8125 | 3.525 |
| 0.8131944444444444 | 3.525 |
| 0.813888888888889 | 3.525 |
| 0.8145833333333333 | 3.525 |
| 0.8152777777777778 | 3.525 |
| 0.8159722222222222 | 3.525 |
| 0.8166666666666668 | 3.525 |
| 0.8173611111111111 | 3.525 |
| 0.8180555555555555 | 3.525 |
| 0.81875 | 3.525 |
| 0.8194444444444445 | 3.525 |
| 0.8201388888888889 | 3.525 |
| 0.8208333333333333 | 3.525 |
| 0.8215277777777777 | 3.525 |
| 0.8222222222222223 | 3.525 |
| 0.8229166666666666 | 3.525 |
| 0.8236111111111111 | 3.525 |
| 0.8243055555555556 | 3.525 |
| 0.8250000000000001 | 3.525 |
| 0.8256944444444444 | 3.525 |
| 0.8263888888888888 | 3.525 |
| 0.8270833333333334 | 3.525 |
| 0.8277777777777778 | 3.525 |
| 0.8284722222222222 | 0 |
| 0.8291666666666666 | 0 |
| 0.8298611111111112 | 0 |
| 0.8305555555555556 | 0 |
| 0.8312499999999999 | 3.525 |
| 0.8319444444444444 | 0 |
| 0.8326388888888889 | 0 |
| 0.8333333333333334 | 3.525 |
| 0.8340277777777777 | 0 |
| 0.8347222222222223 | 3.525 |
| 0.8354166666666667 | 0 |
| 0.8361111111111111 | 0 |
| 0.8368055555555555 | 0 |
| 0.8375 | 0 |
| 0.8381944444444445 | 0 |
| 0.8388888888888889 | 0 |
| 0.8395833333333332 | 0 |
| 0.8402777777777778 | 0 |
| 0.8409722222222222 | 0 |
| 0.8416666666666667 | 0 |
| 0.842361111111111 | 0 |
| 0.8430555555555556 | 0 |
| 0.84375 | 0 |
| 0.8444444444444444 | 0 |
| 0.845138888888889 | 0 |
| 0.8458333333333333 | 0 |
| 0.8465277777777778 | 0 |
| 0.8472222222222222 | 0 |
| 0.8479166666666668 | 0 |
| 0.8486111111111111 | 0 |
| 0.8493055555555555 | 0 |
| 0.85 | 0 |
| 0.8506944444444445 | 0 |
| 0.8513888888888889 | 0 |
| 0.8520833333333333 | 0 |
| 0.8527777777777777 | 0 |
| 0.8534722222222223 | 0 |
| 0.8541666666666666 | 0 |
| 0.8548611111111111 | 0 |
| 0.8555555555555556 | 0 |
| 0.8562500000000001 | 0 |
| 0.8569444444444444 | 0 |
| 0.8576388888888888 | 0 |
| 0.8583333333333334 | 0 |
| 0.8590277777777778 | 0 |
| 0.8597222222222222 | 0 |
| 0.8604166666666666 | 0 |
| 0.8611111111111112 | 0 |
| 0.8618055555555556 | 0 |
| 0.8624999999999999 | 0 |
| 0.8631944444444444 | 0 |
| 0.8638888888888889 | 0 |
| 0.8645833333333334 | 0 |
| 0.8652777777777777 | 0 |
| 0.8659722222222223 | 0 |
| 0.8666666666666667 | 0 |
| 0.8673611111111111 | 0 |
| 0.8680555555555555 | 0 |
| 0.86875 | 0 |
| 0.8694444444444445 | 0 |
| 0.8701388888888889 | 0 |
| 0.8708333333333332 | 0 |
| 0.8715277777777778 | 0 |
| 0.8722222222222222 | 0 |
| 0.8729166666666667 | 0 |
| 0.873611111111111 | 0 |
| 0.8743055555555556 | 0 |
| 0.875 | 0 |
| 0.8756944444444444 | 0 |
| 0.876388888888889 | 0 |
| 0.8770833333333333 | 0 |
| 0.8777777777777778 | 0 |
| 0.8784722222222222 | 0 |
| 0.8791666666666668 | 0 |
| 0.8798611111111111 | 0 |
| 0.8805555555555555 | 0 |
| 0.88125 | 0 |
| 0.8819444444444445 | 0 |
| 0.8826388888888889 | 0 |
| 0.8833333333333333 | 0 |
| 0.8840277777777777 | 0 |
| 0.8847222222222223 | 0 |
| 0.8854166666666666 | 0 |
| 0.8861111111111111 | 0 |
| 0.8868055555555556 | 0 |
| 0.8875000000000001 | 0 |
| 0.8881944444444444 | 0 |
| 0.8888888888888888 | 0 |
| 0.8895833333333334 | 0 |
| 0.8902777777777778 | 0 |
| 0.8909722222222222 | 0 |
| 0.8916666666666666 | 0 |
| 0.8923611111111112 | 0 |
| 0.8930555555555556 | 0 |
| 0.8937499999999999 | 0 |
| 0.8944444444444444 | 0 |
| 0.8951388888888889 | 0 |
| 0.8958333333333334 | 0 |
| 0.8965277777777777 | 0 |
| 0.8972222222222223 | 0 |
| 0.8979166666666667 | 0 |
| 0.8986111111111111 | 0 |
| 0.8993055555555555 | 0 |
| 0.9 | 0 |
| 0.9006944444444445 | 0 |
| 0.9013888888888889 | 0 |
| 0.9020833333333332 | 0 |
| 0.9027777777777778 | 0 |
| 0.9034722222222222 | 0 |
| 0.9041666666666667 | 0 |
| 0.904861111111111 | 0 |
| 0.9055555555555556 | 0 |
| 0.90625 | 0 |
| 0.9069444444444444 | 0 |
| 0.907638888888889 | 0 |
| 0.9083333333333333 | 0 |
| 0.9090277777777778 | 0 |
| 0.9097222222222222 | 0 |
| 0.9104166666666668 | 0 |
| 0.9111111111111111 | 0 |
| 0.9118055555555555 | 0 |
| 0.9125 | 0 |
| 0.9131944444444445 | 0 |
| 0.9138888888888889 | 0 |
| 0.9145833333333333 | 0 |
| 0.9152777777777777 | 0 |
| 0.9159722222222223 | 0 |
| 0.9166666666666666 | 0 |
| 0.9173611111111111 | 0 |
| 0.9180555555555556 | 0 |
| 0.9187500000000001 | 0 |
| 0.9194444444444444 | 0 |
| 0.9201388888888888 | 0 |
| 0.9208333333333334 | 0 |
| 0.9215277777777778 | 0 |
| 0.9222222222222222 | 0 |
| 0.9229166666666666 | 0 |
| 0.9236111111111112 | 0 |
| 0.9243055555555556 | 0 |
| 0.9249999999999999 | 0 |
| 0.9256944444444444 | 0 |
| 0.9263888888888889 | 0 |
| 0.9270833333333334 | 0 |
| 0.9277777777777777 | 0 |
| 0.9284722222222223 | 0 |
| 0.9291666666666667 | 0 |
| 0.9298611111111111 | 0 |
| 0.9305555555555555 | 0 |
| 0.93125 | 0 |
| 0.9319444444444445 | 0 |
| 0.9326388888888889 | 0 |
| 0.9333333333333332 | 0 |
| 0.9340277777777778 | 0 |
| 0.9347222222222222 | 0 |
| 0.9354166666666667 | 0 |
| 0.936111111111111 | 0 |
| 0.9368055555555556 | 0 |
| 0.9375 | 0 |
| 0.9381944444444444 | 0 |
| 0.938888888888889 | 0 |
| 0.9395833333333333 | 0 |
| 0.9402777777777778 | 0 |
| 0.9409722222222222 | 0 |
| 0.9416666666666668 | 0 |
| 0.9423611111111111 | 0 |
| 0.9430555555555555 | 0 |
| 0.94375 | 0 |
| 0.9444444444444445 | 0 |
| 0.9451388888888889 | 0 |
| 0.9458333333333333 | 0 |
| 0.9465277777777777 | 0 |
| 0.9472222222222223 | 0 |
| 0.9479166666666666 | 0 |
| 0.9486111111111111 | 0 |
| 0.9493055555555556 | 0 |
| 0.9500000000000001 | 0 |
| 0.9506944444444444 | 0 |
| 0.9513888888888888 | 0 |
| 0.9520833333333334 | 0 |
| 0.9527777777777778 | 0 |
| 0.9534722222222222 | 0 |
| 0.9541666666666666 | 0 |
| 0.9548611111111112 | 0 |
| 0.9555555555555556 | 0 |
| 0.9562499999999999 | 0 |
| 0.9569444444444444 | 0 |
| 0.9576388888888889 | 0 |
| 0.9583333333333334 | 0 |
| 0.9590277777777777 | 0 |
| 0.9597222222222223 | 0 |
| 0.9604166666666667 | 0 |
| 0.9611111111111111 | 0 |
| 0.9618055555555555 | 0 |
| 0.9625 | 0 |
| 0.9631944444444445 | 0 |
| 0.9638888888888889 | 0 |
| 0.9645833333333332 | 0 |
| 0.9652777777777778 | 0 |
| 0.9659722222222222 | 0 |
| 0.9666666666666667 | 0 |
| 0.967361111111111 | 0 |
| 0.9680555555555556 | 0 |
| 0.96875 | 0 |
| 0.9694444444444444 | 0 |
| 0.970138888888889 | 0 |
| 0.9708333333333333 | 0 |
| 0.9715277777777778 | 0 |
| 0.9722222222222222 | 0 |
| 0.9729166666666668 | 0 |
| 0.9736111111111111 | 0 |
| 0.9743055555555555 | 0 |
| 0.975 | 0 |
| 0.9756944444444445 | 0 |
| 0.9763888888888889 | 0 |
| 0.9770833333333333 | 0 |
| 0.9777777777777777 | 0 |
| 0.9784722222222223 | 0 |
| 0.9791666666666666 | 0 |
| 0.9798611111111111 | 0 |
| 0.9805555555555556 | 0 |
| 0.9812500000000001 | 0 |
| 0.9819444444444444 | 0 |
| 0.9826388888888888 | 0 |
| 0.9833333333333334 | 0 |
| 0.9840277777777778 | 0 |
| 0.9847222222222222 | 0 |
| 0.9854166666666666 | 0 |
| 0.9861111111111112 | 0 |
| 0.9868055555555556 | 0 |
| 0.9874999999999999 | 0 |
| 0.9881944444444444 | 0 |
| 0.9888888888888889 | 0 |
| 0.9895833333333334 | 0 |
| 0.9902777777777777 | 0 |
| 0.9909722222222223 | 0 |
| 0.9916666666666667 | 0 |
| 0.9923611111111111 | 0 |
| 0.9930555555555555 | 0 |
| 0.99375 | 0 |
| 0.9944444444444445 | 0 |
| 0.9951388888888889 | 0 |
| 0.9958333333333332 | 0 |
| 0.9965277777777778 | 0 |
| 0.9972222222222222 | 0 |
| 0.9979166666666667 | 0 |
| 0.998611111111111 | 0 |
| 0.9993055555555556 | 0 |